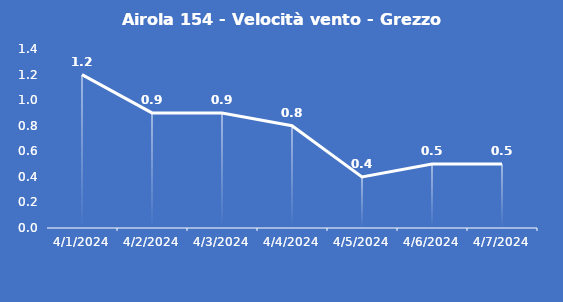
| Category | Airola 154 - Velocità vento - Grezzo (m/s) |
|---|---|
| 4/1/24 | 1.2 |
| 4/2/24 | 0.9 |
| 4/3/24 | 0.9 |
| 4/4/24 | 0.8 |
| 4/5/24 | 0.4 |
| 4/6/24 | 0.5 |
| 4/7/24 | 0.5 |